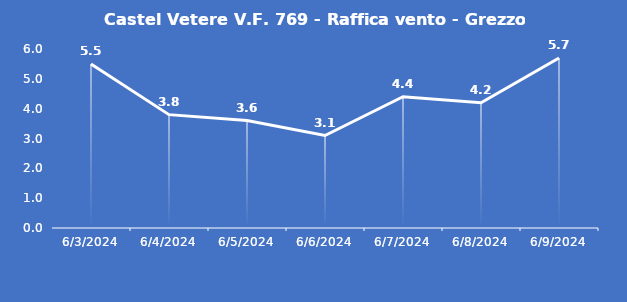
| Category | Castel Vetere V.F. 769 - Raffica vento - Grezzo (m/s) |
|---|---|
| 6/3/24 | 5.5 |
| 6/4/24 | 3.8 |
| 6/5/24 | 3.6 |
| 6/6/24 | 3.1 |
| 6/7/24 | 4.4 |
| 6/8/24 | 4.2 |
| 6/9/24 | 5.7 |